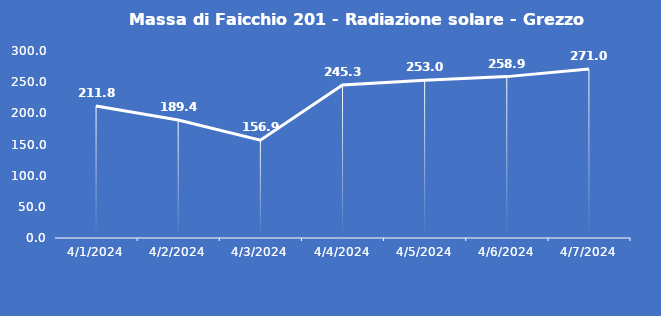
| Category | Massa di Faicchio 201 - Radiazione solare - Grezzo (W/m2) |
|---|---|
| 4/1/24 | 211.8 |
| 4/2/24 | 189.4 |
| 4/3/24 | 156.9 |
| 4/4/24 | 245.3 |
| 4/5/24 | 253 |
| 4/6/24 | 258.9 |
| 4/7/24 | 271 |